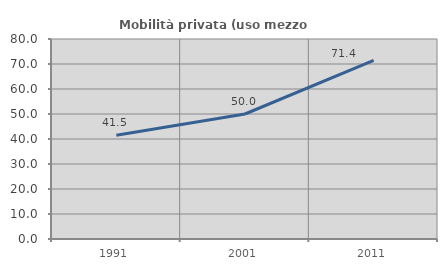
| Category | Mobilità privata (uso mezzo privato) |
|---|---|
| 1991.0 | 41.463 |
| 2001.0 | 50 |
| 2011.0 | 71.429 |